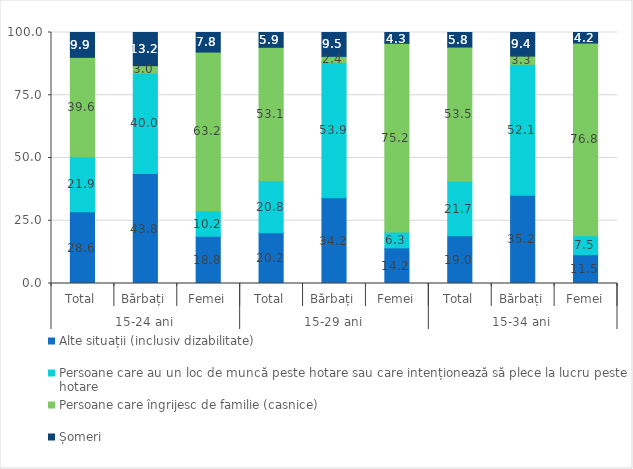
| Category | Alte situații (inclusiv dizabilitate) | Persoane care au un loc de muncă peste hotare sau care intenționează să plece la lucru peste hotare | Persoane care îngrijesc de familie (casnice) | Șomeri |
|---|---|---|---|---|
| 0 | 28.6 | 21.9 | 39.6 | 9.9 |
| 1 | 43.8 | 40 | 3 | 13.2 |
| 2 | 18.8 | 10.2 | 63.2 | 7.8 |
| 3 | 20.2 | 20.8 | 53.1 | 5.9 |
| 4 | 34.2 | 53.9 | 2.4 | 9.5 |
| 5 | 14.2 | 6.3 | 75.2 | 4.3 |
| 6 | 19 | 21.7 | 53.5 | 5.8 |
| 7 | 35.2 | 52.1 | 3.3 | 9.4 |
| 8 | 11.5 | 7.5 | 76.8 | 4.2 |